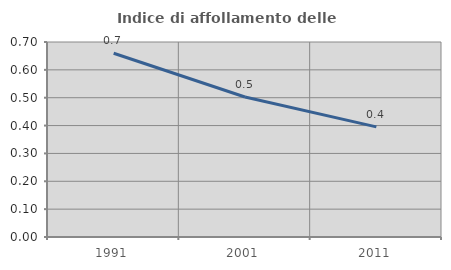
| Category | Indice di affollamento delle abitazioni  |
|---|---|
| 1991.0 | 0.66 |
| 2001.0 | 0.503 |
| 2011.0 | 0.395 |